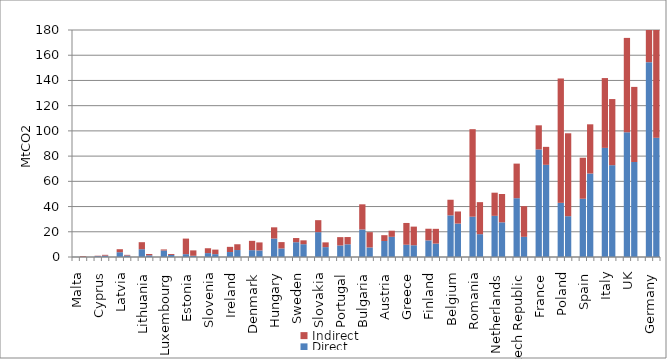
| Category | Direct | Indirect |
|---|---|---|
| Malta | 0.059 | 0 |
|  | 0.102 | 0.547 |
|  | 0 | 0 |
| Cyprus | 0.68 | 0.318 |
|  | 1.07 | 0.65 |
|  | 0 | 0 |
| Latvia | 3.805 | 2.37 |
|  | 1.155 | 0.533 |
|  | 0 | 0 |
| Lithuania | 6.184 | 5.559 |
|  | 1.35 | 1.042 |
|  | 0 | 0 |
| Luxembourg | 5.163 | 0.823 |
|  | 1.609 | 0.757 |
|  | 0 | 0 |
| Estonia | 2.258 | 12.339 |
|  | 0.982 | 4.265 |
|  | 0 | 0 |
| Slovenia | 3.085 | 3.858 |
|  | 2.269 | 3.592 |
|  | 0 | 0 |
| Ireland | 3.94 | 4.11 |
|  | 5.523 | 4.59 |
|  | 0 | 0 |
| Denmark | 5.424 | 7.38 |
|  | 5.199 | 6.37 |
|  | 0 | 0 |
| Hungary | 14.636 | 8.898 |
|  | 6.77 | 5.046 |
|  | 0 | 0 |
| Sweden | 11.716 | 3.326 |
|  | 10.151 | 3.073 |
|  | 0 | 0 |
| Slovakia | 19.712 | 9.498 |
|  | 7.829 | 3.765 |
|  | 0 | 0 |
| Portugal | 9.157 | 6.602 |
|  | 10.061 | 5.772 |
|  | 0 | 0 |
| Bulgaria | 21.821 | 19.955 |
|  | 7.574 | 12.141 |
|  | 0 | 0 |
| Austria | 12.685 | 4.622 |
|  | 15.997 | 4.852 |
|  | 0 | 0 |
| Greece | 9.725 | 17.266 |
|  | 9.308 | 14.791 |
|  | 0 | 0 |
| Finland | 13.172 | 9.242 |
|  | 10.634 | 11.703 |
|  | 0 | 0 |
| Belgium | 33.018 | 12.387 |
|  | 26.514 | 9.583 |
|  | 0 | 0 |
| Romania | 31.958 | 69.4 |
|  | 18.086 | 25.414 |
|  | 0 | 0 |
| Netherlands | 32.653 | 18.339 |
|  | 27.499 | 22.479 |
|  | 0 | 0 |
| Czech Republic | 46.616 | 27.442 |
|  | 15.994 | 24.325 |
|  | 0 | 0 |
| France | 85.307 | 19.111 |
|  | 73.084 | 14.253 |
|  | 0 | 0 |
| Poland | 42.937 | 98.63 |
|  | 32.353 | 65.742 |
|  | 0 | 0 |
| Spain | 46.19 | 32.514 |
|  | 66.195 | 39.023 |
|  | 0 | 0 |
| Italy | 86.528 | 55.356 |
|  | 72.804 | 52.437 |
|  | 0 | 0 |
| UK | 98.892 | 74.848 |
|  | 75.32 | 59.564 |
|  | 0 | 0 |
| Germany | 154.482 | 154.921 |